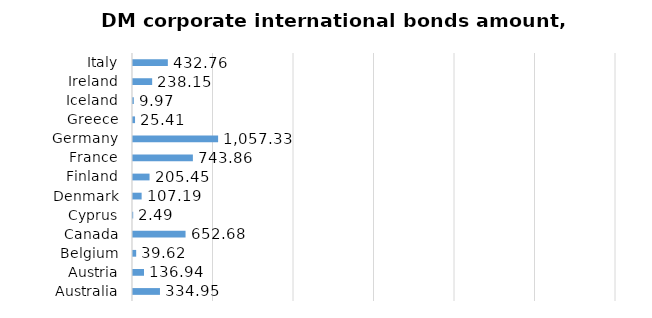
| Category | Series 0 |
|---|---|
| Australia | 334.953 |
| Austria | 136.944 |
| Belgium | 39.623 |
| Canada | 652.677 |
| Cyprus | 2.495 |
| Denmark | 107.195 |
| Finland | 205.445 |
| France | 743.864 |
| Germany | 1057.325 |
| Greece | 25.41 |
| Iceland | 9.965 |
| Ireland | 238.148 |
| Italy | 432.763 |